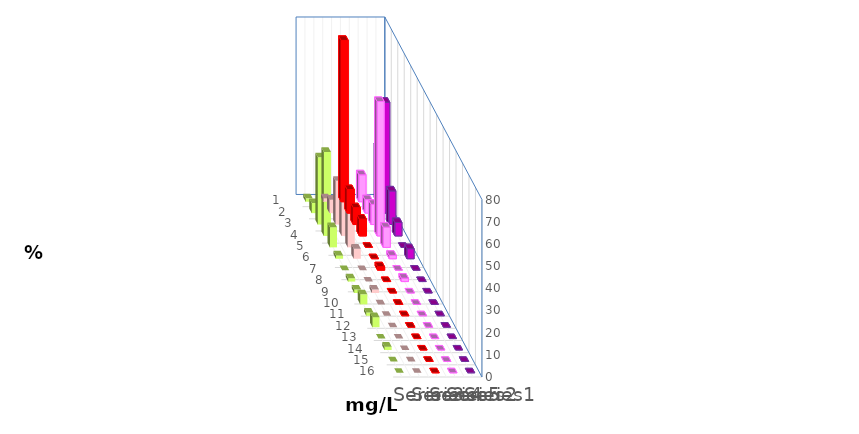
| Category | Series 2 | Series 3 | Series 4 | Series 1 | Series 0 |
|---|---|---|---|---|---|
| 0 | 72.727 | 12.121 | 24.242 | 1.515 | 1.515 |
| 1 | 10.606 | 6.061 | 50 | 6.061 | 4.545 |
| 2 | 7.576 | 9.091 | 15.152 | 19.697 | 30.303 |
| 3 | 7.576 | 60.606 | 6.061 | 50 | 37.879 |
| 4 | 0 | 9.091 | 0 | 16.667 | 9.091 |
| 5 | 0 | 1.515 | 4.545 | 4.545 | 1.515 |
| 6 | 1.515 | 0 | 0 | 0 | 0 |
| 7 | 0 | 1.515 | 0 | 0 | 1.515 |
| 8 | 0 | 0 | 0 | 1.515 | 1.515 |
| 9 | 0 | 0 | 0 | 0 | 4.545 |
| 10 | 0 | 0 | 0 | 0 | 1.515 |
| 11 | 0 | 0 | 0 | 0 | 4.545 |
| 12 | 0 | 0 | 0 | 0 | 0 |
| 13 | 0 | 0 | 0 | 0 | 1.515 |
| 14 | 0 | 0 | 0 | 0 | 0 |
| 15 | 0 | 0 | 0 | 0 | 0 |